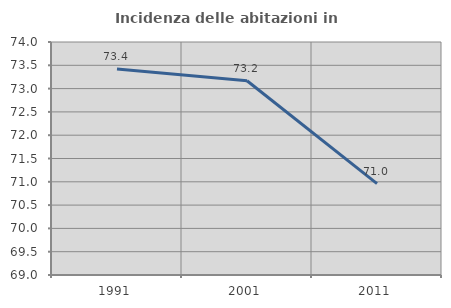
| Category | Incidenza delle abitazioni in proprietà  |
|---|---|
| 1991.0 | 73.42 |
| 2001.0 | 73.169 |
| 2011.0 | 70.96 |